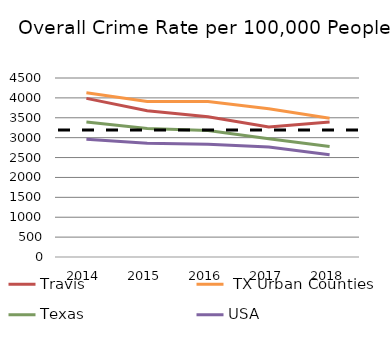
| Category | Travis  | Series 1 | Texas | USA |
|---|---|---|---|---|
| 2014.0 | 3988 | 4127.394 | 3392.2 | 2961.582 |
| 2015.0 | 3676.616 | 3909.823 | 3233.3 | 2859.613 |
| 2016.0 | 3526 | 3907 | 3182.7 | 2837 |
| 2017.0 | 3270 | 3725 | 2975 | 2767 |
| 2018.0 | 3394.428 | 3489.609 | 2776.56 | 2568.373 |